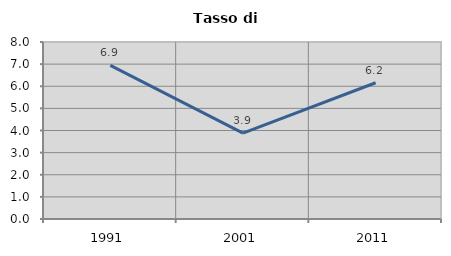
| Category | Tasso di disoccupazione   |
|---|---|
| 1991.0 | 6.946 |
| 2001.0 | 3.884 |
| 2011.0 | 6.157 |